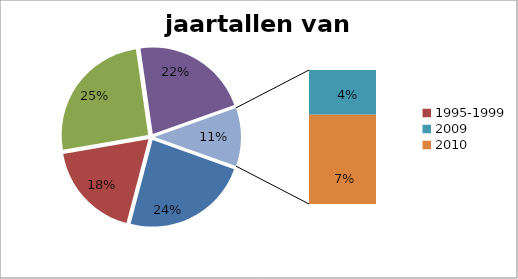
| Category | jaartal van publicatie | 13 10 14 12 2 4 |
|---|---|---|
| Voor 1995 | 13 |  |
| 1995-1999 | 10 |  |
| 2000-2005 | 14 |  |
| 2006-2008 | 12 |  |
| 2009 | 2 |  |
| 2010 | 4 |  |